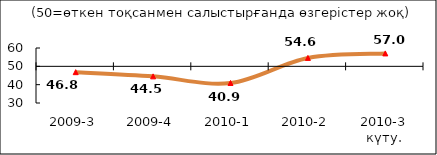
| Category | Диф.индекс ↓ |
|---|---|
| 2009-3 | 46.82 |
| 2009-4 | 44.53 |
| 2010-1 | 40.91 |
| 2010-2 | 54.59 |
| 2010-3 күту. | 57.045 |